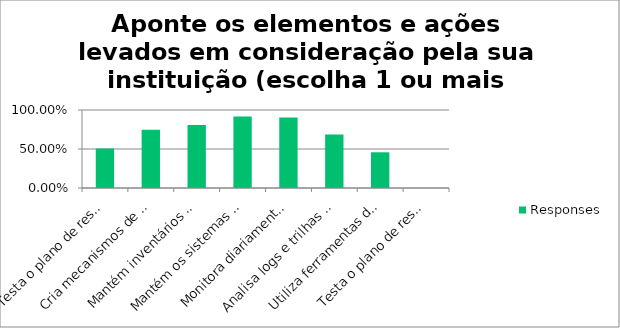
| Category | Responses |
|---|---|
| Testa o plano de resposta a incidentes, simulando os cenários especificados durante sua criação. | 0.506 |
| Cria mecanismos de monitoramento de todas as ações de proteção implementadas. | 0.747 |
| Mantém inventários atualizados de hardware e software, e os verifica com frequência para identificar elementos estranhos à instituição (por exemplo, computadores não autorizados ou software não licenciado). | 0.807 |
| Mantém os sistemas operacionais e softwares de aplicação sempre atualizados. | 0.916 |
| Monitora diariamente as rotinas de backup, executando testes regulares de restauração dos dados. | 0.904 |
| Analisa logs e trilhas de auditoria criados, de forma a permitir a rápida identificação de ataques, sejam internos ou externos. | 0.687 |
| Utiliza ferramentas de centralização e análise de logs. | 0.458 |
| Testa o plano de resposta a incidentes, simulando os cenários especificados durante sua criação. | 0 |